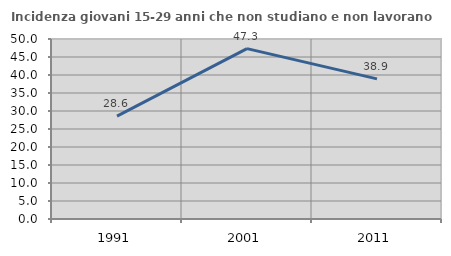
| Category | Incidenza giovani 15-29 anni che non studiano e non lavorano  |
|---|---|
| 1991.0 | 28.587 |
| 2001.0 | 47.325 |
| 2011.0 | 38.918 |